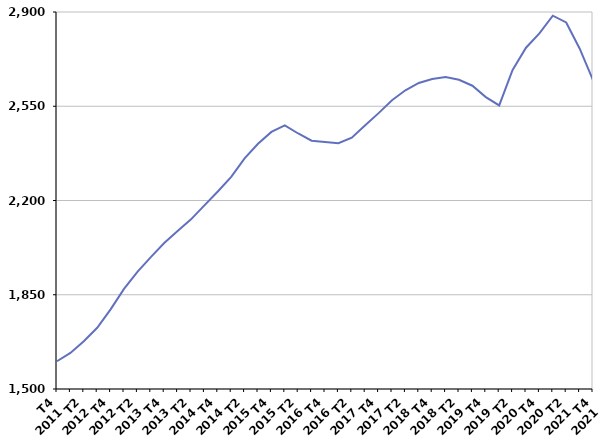
| Category | Inscrits depuis plus d'un an |
|---|---|
| T4
2011 | 1603.1 |
| T1
2012 | 1634 |
| T2
2012 | 1677.1 |
| T3
2012 | 1727.4 |
| T4
2012 | 1795.8 |
| T1
2013 | 1871.7 |
| T2
2013 | 1934.7 |
| T3
2013 | 1989.7 |
| T4
2013 | 2041.9 |
| T1
2014 | 2087 |
| T2
2014 | 2129.9 |
| T3
2014 | 2181.8 |
| T4
2014 | 2233.3 |
| T1
2015 | 2287.7 |
| T2
2015 | 2356.6 |
| T3
2015 | 2410.6 |
| T4
2015 | 2454.6 |
| T1
2016 | 2478.9 |
| T2
2016 | 2448.8 |
| T3
2016 | 2422.1 |
| T4
2016 | 2417.6 |
| T1
2017 | 2412.9 |
| T2
2017 | 2433.5 |
| T3
2017 | 2479.3 |
| T4
2017 | 2524.4 |
| T1
2018 | 2572.2 |
| T2
2018 | 2609.3 |
| T3
2018 | 2636.4 |
| T4
2018 | 2651.2 |
| T1
2019 | 2658.4 |
| T2
2019 | 2648.3 |
| T3
2019 | 2626.2 |
| T4
2019 | 2584.1 |
| T1
2020 | 2553.1 |
| T2
2020 | 2685.1 |
| T3
2020 | 2767.4 |
| T4
2020 | 2820.5 |
| T1
2021 | 2886.3 |
| T2
2021 | 2861.2 |
| T3
2021 | 2764.6 |
| T4
2021 | 2647.1 |